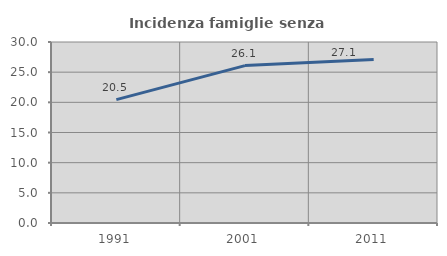
| Category | Incidenza famiglie senza nuclei |
|---|---|
| 1991.0 | 20.451 |
| 2001.0 | 26.092 |
| 2011.0 | 27.094 |